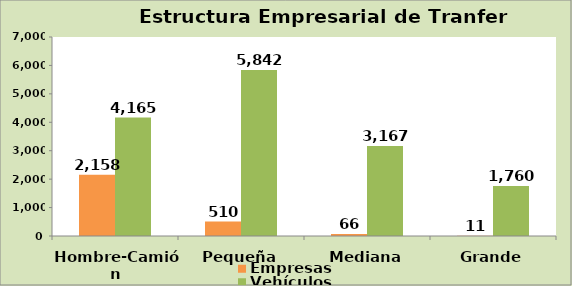
| Category | Empresas | Vehículos |
|---|---|---|
| Hombre-Camión | 2158 | 4165 |
| Pequeña | 510 | 5842 |
| Mediana | 66 | 3167 |
| Grande | 11 | 1760 |